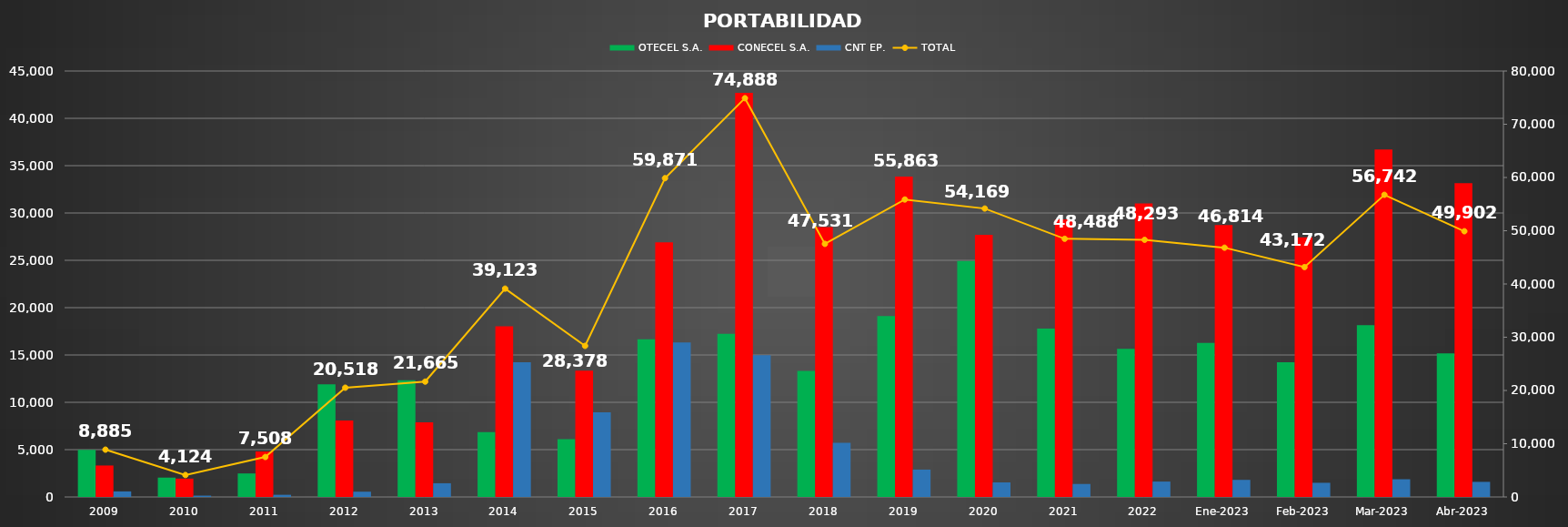
| Category | OTECEL S.A. | CONECEL S.A. | CNT EP. |
|---|---|---|---|
| 2009 | 4973 | 3324 | 588 |
| 2010 | 2045 | 1939 | 140 |
| 2011 | 2484 | 4796 | 228 |
| 2012 | 11894 | 8067 | 557 |
| 2013 | 12323 | 7893 | 1449 |
| 2014 | 6853 | 18039 | 14231 |
| 2015 | 6105 | 13334 | 8939 |
| 2016 | 16653 | 26907 | 16311 |
| 2017 | 17228 | 42694 | 14966 |
| 2018 | 13309 | 28504 | 5718 |
| 2019 | 19116 | 33857 | 2890 |
| 2020 | 24933 | 27700 | 1536 |
| 2021 | 17795 | 29321 | 1372 |
| 2022 | 15655 | 31012 | 1626 |
| Ene-2023 | 16278 | 28730 | 1806 |
| Feb-2023 | 14237 | 27438 | 1497 |
| Mar-2023 | 18159 | 36713 | 1870 |
| Abr-2023 | 15167 | 33140 | 1595 |